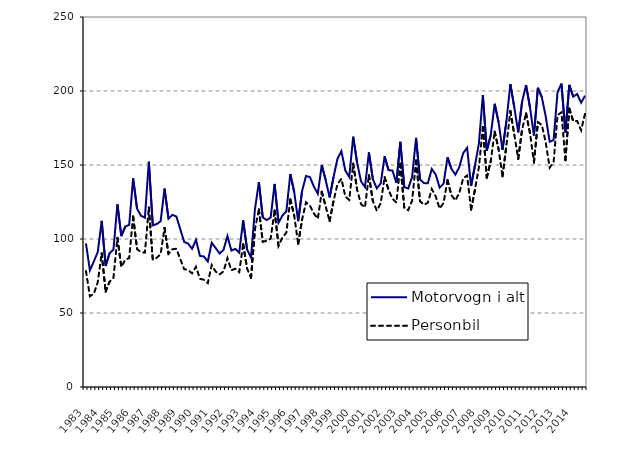
| Category | Motorvogn i alt | Personbil |
|---|---|---|
| 1983.0 | 97 | 78.3 |
| nan | 78.8 | 61.3 |
| nan | 84.8 | 63 |
| nan | 91.2 | 70.8 |
| 1984.0 | 112.2 | 90.4 |
| nan | 81.8 | 64.4 |
| nan | 90.4 | 71.1 |
| nan | 92.9 | 73.9 |
| 1985.0 | 123.4 | 100.8 |
| nan | 102 | 81.1 |
| nan | 108.4 | 86 |
| nan | 109.6 | 87.1 |
| 1986.0 | 141 | 115.2 |
| nan | 120.5 | 93.2 |
| nan | 115.7 | 91.1 |
| nan | 114.4 | 90.8 |
| 1987.0 | 152.2 | 121.3 |
| nan | 109.2 | 86.1 |
| nan | 110.1 | 87.3 |
| nan | 112 | 89.8 |
| 1988.0 | 134.1 | 107.5 |
| nan | 113.7 | 90 |
| nan | 116.3 | 93.1 |
| nan | 115.2 | 93.4 |
| 1989.0 | 106.6 | 86.4 |
| nan | 98 | 79.6 |
| nan | 96.9 | 79 |
| nan | 93.4 | 76.8 |
| 1990.0 | 99.4 | 81.3 |
| nan | 88.6 | 73.1 |
| nan | 88.2 | 72.5 |
| nan | 84.8 | 70.2 |
| 1991.0 | 97.5 | 82.4 |
| nan | 93.9 | 78 |
| nan | 90.2 | 76.1 |
| nan | 92.6 | 78.1 |
| 1992.0 | 102 | 87.1 |
| nan | 92.2 | 78.9 |
| nan | 93.3 | 79.9 |
| nan | 90.8 | 77.6 |
| 1993.0 | 112.6 | 96.5 |
| nan | 93 | 80.1 |
| nan | 87.5 | 73.6 |
| nan | 120.1 | 106.6 |
| 1994.0 | 138.4 | 120 |
| nan | 114.5 | 98.1 |
| nan | 112.8 | 98.8 |
| nan | 114.5 | 100.2 |
| 1995.0 | 137.2 | 119.3 |
| nan | 111 | 95.4 |
| nan | 115.9 | 101 |
| nan | 118.8 | 104.4 |
| 1996.0 | 143.9 | 126.9 |
| nan | 131.6 | 115.7 |
| nan | 112 | 96.7 |
| nan | 132.5 | 113.1 |
| 1997.0 | 142.6 | 124.8 |
| nan | 141.8 | 122.5 |
| nan | 135.4 | 117.3 |
| nan | 130.6 | 113.7 |
| 1998.0 | 150 | 131.9 |
| nan | 139.8 | 122 |
| nan | 128.1 | 112.1 |
| nan | 141.8 | 125.6 |
| 1999.0 | 154.2 | 137.1 |
| nan | 159.3 | 140.7 |
| nan | 146.3 | 128.7 |
| nan | 141.9 | 126.4 |
| 2000.0 | 169.1 | 150.9 |
| nan | 151.5 | 133.4 |
| nan | 139 | 123.5 |
| nan | 135.1 | 121.4 |
| 2001.0 | 158.5 | 143.1 |
| nan | 140.46 | 125.7 |
| nan | 134.24 | 119.2 |
| nan | 137.495 | 124.072 |
| 2002.0 | 155.814 | 141.724 |
| nan | 146.543 | 133.19 |
| nan | 146.231 | 127.141 |
| nan | 137.967 | 124.641 |
| 2003.0 | 165.679 | 150.811 |
| nan | 135.021 | 121.101 |
| nan | 134.111 | 119.491 |
| nan | 142.013 | 125.959 |
| 2004.0 | 168.309 | 153.043 |
| nan | 140.267 | 125.568 |
| nan | 137.77 | 123.121 |
| nan | 137.685 | 124.506 |
| 2005.0 | 147.311 | 133.756 |
| nan | 143.517 | 128.79 |
| nan | 134.783 | 120.571 |
| nan | 137.37 | 124.382 |
| 2006.0 | 155.213 | 139.728 |
| nan | 147.444 | 129.572 |
| nan | 143.451 | 126.006 |
| nan | 148.561 | 131.195 |
| 2007.0 | 158.1 | 141.084 |
| nan | 161.613 | 142.897 |
| nan | 135.821 | 119.753 |
| nan | 149.791 | 133.498 |
| 2008.0 | 164.642 | 148.614 |
| nan | 197.287 | 175.714 |
| nan | 159.718 | 141.407 |
| nan | 170.057 | 152.54 |
| 2009.0 | 191.38 | 172.559 |
| nan | 178.906 | 160.765 |
| nan | 160.234 | 142.312 |
| nan | 179.857 | 163.532 |
| 2010.0 | 204.636 | 186.507 |
| nan | 188.957 | 170.463 |
| nan | 172.077 | 154.156 |
| nan | 192.961 | 174.399 |
| 2011.0 | 204.005 | 184.86 |
| nan | 188.741 | 171.333 |
| nan | 169.934 | 151.694 |
| nan | 202.176 | 178.919 |
| 2012.0 | 195.829 | 177.072 |
| nan | 182.751 | 165.128 |
| nan | 165.73 | 148.242 |
| nan | 166.805 | 151.728 |
| 2013.0 | 199.181 | 183.653 |
| nan | 205.015 | 185.634 |
| nan | 172.044 | 153.21 |
| nan | 204.1 | 188.079 |
| 2014.0 | 196.177 | 179.552 |
| nan | 197.965 | 179.767 |
| nan | 192.105 | 173.474 |
| nan | 196.809 | 184.739 |